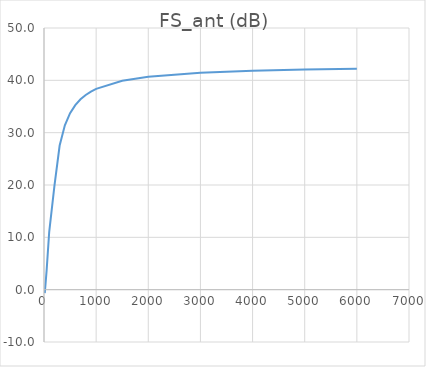
| Category |  FS_ant (dB) |
|---|---|
| 15.0 | -0.667 |
| 50.0 | 3.641 |
| 100.0 | 11.057 |
| 200.0 | 19.839 |
| 300.0 | 27.543 |
| 400.0 | 31.403 |
| 500.0 | 33.721 |
| 600.0 | 35.267 |
| 700.0 | 36.371 |
| 800.0 | 37.199 |
| 900.0 | 37.844 |
| 1000.0 | 38.359 |
| 1500.0 | 39.906 |
| 2000.0 | 40.68 |
| 3000.0 | 41.453 |
| 4000.0 | 41.84 |
| 5000.0 | 42.072 |
| 6000.0 | 42.227 |